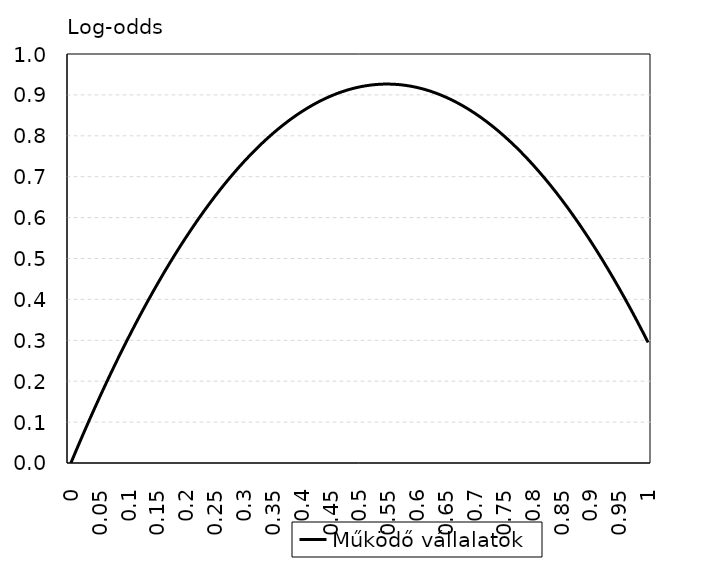
| Category | Működő vállalatok |
|---|---|
| 0.0 | 0 |
| 0.01 | 0.034 |
| 0.02 | 0.066 |
| 0.03 | 0.099 |
| 0.04 | 0.13 |
| 0.05 | 0.161 |
| 0.0600000000000001 | 0.192 |
| 0.0700000000000001 | 0.222 |
| 0.0800000000000001 | 0.251 |
| 0.0900000000000001 | 0.279 |
| 0.1 | 0.307 |
| 0.11 | 0.335 |
| 0.12 | 0.362 |
| 0.13 | 0.388 |
| 0.14 | 0.413 |
| 0.15 | 0.438 |
| 0.16 | 0.462 |
| 0.17 | 0.486 |
| 0.18 | 0.509 |
| 0.19 | 0.531 |
| 0.2 | 0.553 |
| 0.21 | 0.574 |
| 0.22 | 0.595 |
| 0.23 | 0.615 |
| 0.24 | 0.634 |
| 0.25 | 0.653 |
| 0.26 | 0.671 |
| 0.27 | 0.688 |
| 0.28 | 0.705 |
| 0.29 | 0.721 |
| 0.3 | 0.737 |
| 0.31 | 0.752 |
| 0.32 | 0.766 |
| 0.33 | 0.78 |
| 0.34 | 0.793 |
| 0.35 | 0.806 |
| 0.36 | 0.818 |
| 0.37 | 0.829 |
| 0.38 | 0.84 |
| 0.39 | 0.85 |
| 0.4 | 0.859 |
| 0.41 | 0.868 |
| 0.42 | 0.876 |
| 0.43 | 0.884 |
| 0.44 | 0.891 |
| 0.45 | 0.897 |
| 0.46 | 0.903 |
| 0.47 | 0.908 |
| 0.48 | 0.912 |
| 0.49 | 0.916 |
| 0.5 | 0.919 |
| 0.51 | 0.922 |
| 0.52 | 0.924 |
| 0.53 | 0.926 |
| 0.54 | 0.926 |
| 0.55 | 0.926 |
| 0.56 | 0.926 |
| 0.57 | 0.925 |
| 0.58 | 0.923 |
| 0.59 | 0.921 |
| 0.6 | 0.918 |
| 0.61 | 0.915 |
| 0.62 | 0.91 |
| 0.63 | 0.906 |
| 0.64 | 0.9 |
| 0.65 | 0.894 |
| 0.66 | 0.888 |
| 0.67 | 0.88 |
| 0.68 | 0.872 |
| 0.69 | 0.864 |
| 0.7 | 0.855 |
| 0.71 | 0.845 |
| 0.72 | 0.835 |
| 0.73 | 0.824 |
| 0.74 | 0.812 |
| 0.75 | 0.8 |
| 0.76 | 0.787 |
| 0.77 | 0.774 |
| 0.78 | 0.76 |
| 0.79 | 0.745 |
| 0.8 | 0.73 |
| 0.81 | 0.714 |
| 0.82 | 0.698 |
| 0.83 | 0.68 |
| 0.84 | 0.663 |
| 0.85 | 0.644 |
| 0.86 | 0.625 |
| 0.87 | 0.606 |
| 0.88 | 0.585 |
| 0.89 | 0.565 |
| 0.9 | 0.543 |
| 0.91 | 0.521 |
| 0.92 | 0.498 |
| 0.93 | 0.475 |
| 0.94 | 0.451 |
| 0.95 | 0.427 |
| 0.96 | 0.402 |
| 0.97 | 0.376 |
| 0.98 | 0.349 |
| 0.99 | 0.322 |
| 1.0 | 0.295 |